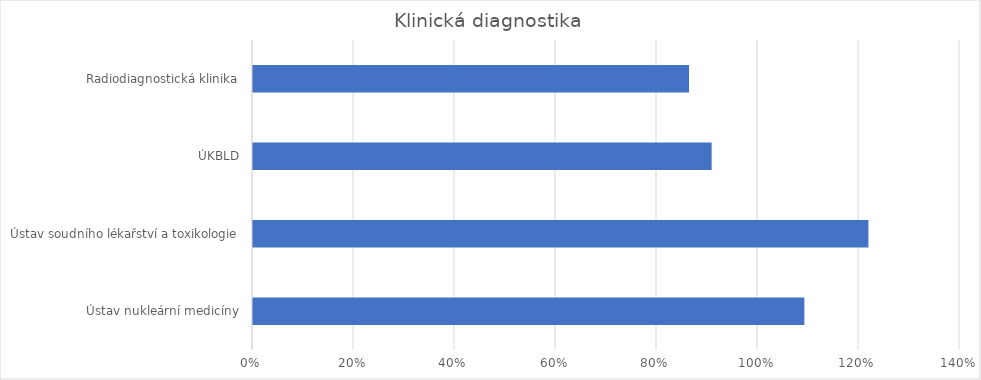
| Category | Series 0 |
|---|---|
| Ústav nukleární medicíny | 1.092 |
| Ústav soudního lékařství a toxikologie | 1.219 |
| ÚKBLD | 0.908 |
| Radiodiagnostická klinika | 0.863 |